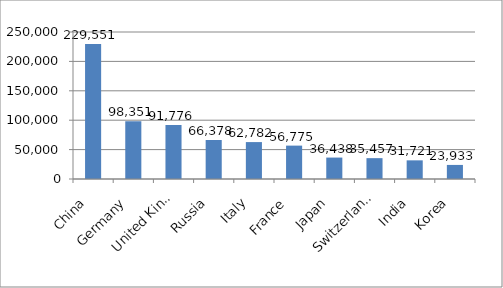
| Category | Series 0 |
|---|---|
|    China | 229551 |
|    Germany | 98351 |
|    United Kingdom | 91776 |
|    Russia | 66378 |
|    Italy | 62782 |
|    France | 56775 |
|    Japan | 36438 |
|    Switzerland | 35457 |
|    India | 31721 |
|    Korea | 23933 |